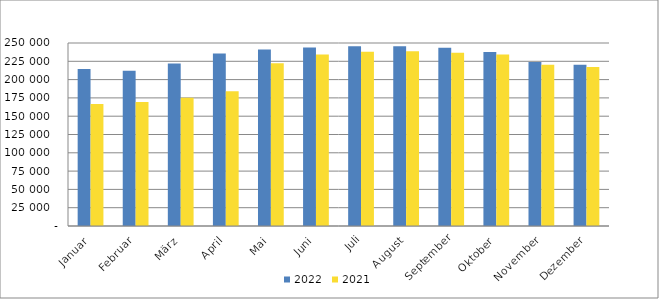
| Category | 2022 | 2021 |
|---|---|---|
| Januar | 214429 | 166782 |
| Februar | 212210 | 169496 |
| März | 221960 | 175211 |
| April | 235651 | 184189 |
| Mai | 240984 | 222364 |
| Juni | 243781 | 234144 |
| Juli | 245413 | 238061 |
| August | 245717 | 238863 |
| September | 243363 | 236822 |
| Oktober | 237801 | 234389 |
| November | 223883 | 220142 |
| Dezember | 220165 | 217291 |